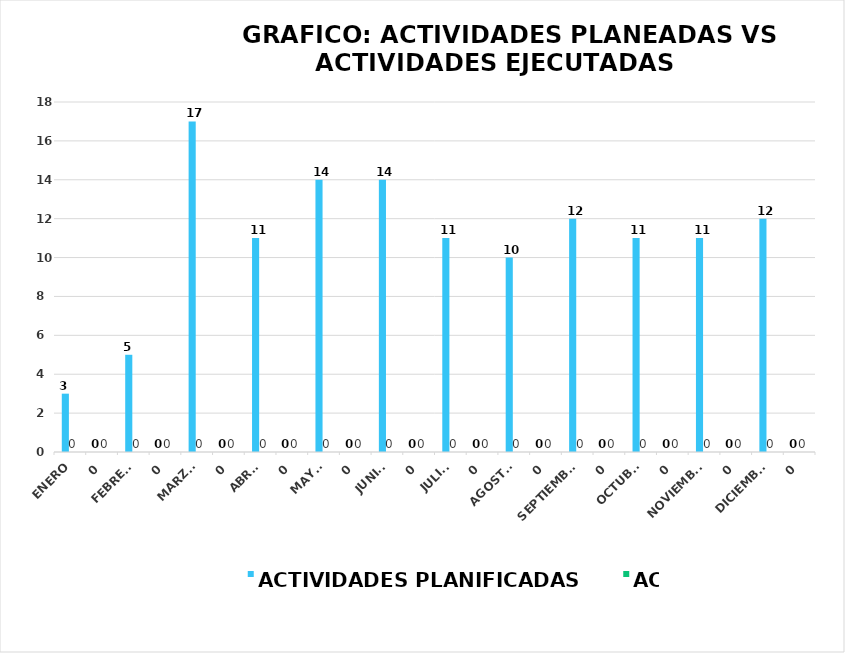
| Category | ACTIVIDADES PLANIFICADAS | ACTIVIDADES EJECUTADAS |
|---|---|---|
| ENERO | 3 | 0 |
| 0 | 0 | 0 |
| FEBRERO | 5 | 0 |
| 0 | 0 | 0 |
| MARZO | 17 | 0 |
| 0 | 0 | 0 |
| ABRIL | 11 | 0 |
| 0 | 0 | 0 |
| MAYO | 14 | 0 |
| 0 | 0 | 0 |
| JUNIO | 14 | 0 |
| 0 | 0 | 0 |
| JULIO | 11 | 0 |
| 0 | 0 | 0 |
| AGOSTO  | 10 | 0 |
| 0 | 0 | 0 |
| SEPTIEMBRE | 12 | 0 |
| 0 | 0 | 0 |
| OCTUBRE | 11 | 0 |
| 0 | 0 | 0 |
| NOVIEMBRE | 11 | 0 |
| 0 | 0 | 0 |
| DICIEMBRE  | 12 | 0 |
| 0 | 0 | 0 |